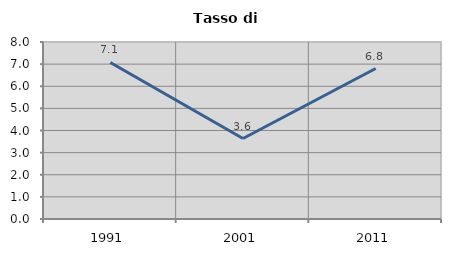
| Category | Tasso di disoccupazione   |
|---|---|
| 1991.0 | 7.077 |
| 2001.0 | 3.636 |
| 2011.0 | 6.802 |